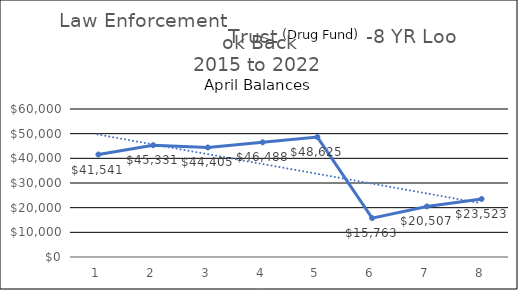
| Category | Law ET |
|---|---|
| 0 | 41540.72 |
| 1 | 45331.3 |
| 2 | 44405.48 |
| 3 | 46487.98 |
| 4 | 48624.88 |
| 5 | 15763.18 |
| 6 | 20506.68 |
| 7 | 23522.64 |